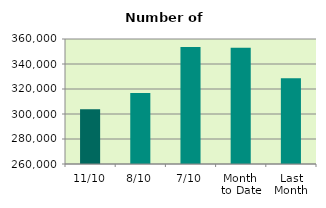
| Category | Series 0 |
|---|---|
| 11/10 | 303834 |
| 8/10 | 316814 |
| 7/10 | 353606 |
| Month 
to Date | 353045.714 |
| Last
Month | 328669.364 |